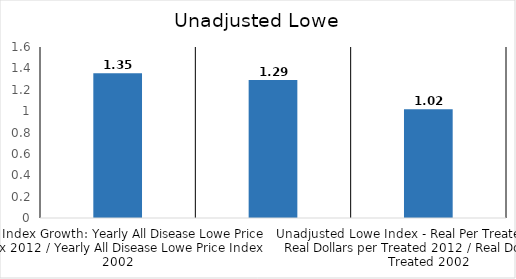
| Category | All Disease |
|---|---|
| Price Index Growth: Yearly All Disease Lowe Price Index 2012 / Yearly All Disease Lowe Price Index 2002 | 1.354 |
|  Real Unadjusted Lowe Index Growth Rate: Real Growth in 2002 dollars: Nominal Growth / Price Index Growth | 1.291 |
| Unadjusted Lowe Index - Real Per Treated Growth: Real Dollars per Treated 2012 / Real Dollars per Treated 2002 | 1.017 |